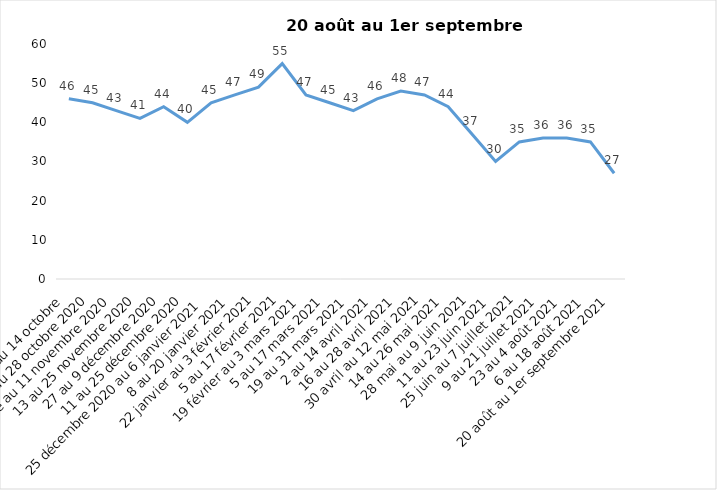
| Category | Toujours aux trois mesures |
|---|---|
| 2 au 14 octobre  | 46 |
| 16 au 28 octobre 2020 | 45 |
| 30 octobre au 11 novembre 2020 | 43 |
| 13 au 25 novembre 2020 | 41 |
| 27 au 9 décembre 2020 | 44 |
| 11 au 25 décembre 2020 | 40 |
| 25 décembre 2020 au 6 janvier 2021 | 45 |
| 8 au 20 janvier 2021 | 47 |
| 22 janvier au 3 février 2021 | 49 |
| 5 au 17 février 2021 | 55 |
| 19 février au 3 mars 2021 | 47 |
| 5 au 17 mars 2021 | 45 |
| 19 au 31 mars 2021 | 43 |
| 2 au 14 avril 2021 | 46 |
| 16 au 28 avril 2021 | 48 |
| 30 avril au 12 mai 2021 | 47 |
| 14 au 26 mai 2021 | 44 |
| 28 mai au 9 juin 2021 | 37 |
| 11 au 23 juin 2021 | 30 |
| 25 juin au 7 juillet 2021 | 35 |
| 9 au 21 juillet 2021 | 36 |
| 23 au 4 août 2021 | 36 |
| 6 au 18 août 2021 | 35 |
| 20 août au 1er septembre 2021 | 27 |